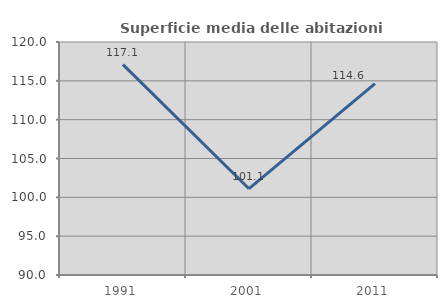
| Category | Superficie media delle abitazioni occupate |
|---|---|
| 1991.0 | 117.094 |
| 2001.0 | 101.109 |
| 2011.0 | 114.632 |